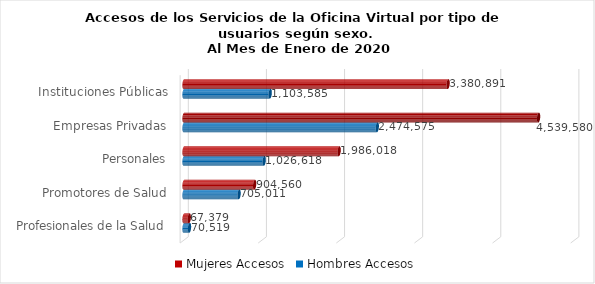
| Category | Mujeres | Hombres |
|---|---|---|
| Instituciones Públicas | 3380891 | 1103585 |
| Empresas Privadas | 4539580 | 2474575 |
| Personales | 1986018 | 1026618 |
| Promotores de Salud | 904560 | 705011 |
| Profesionales de la Salud | 67379 | 70519 |